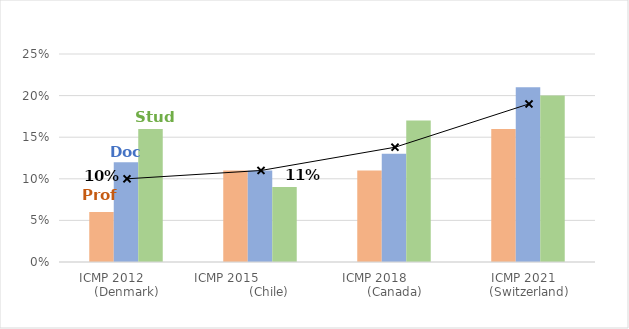
| Category | Professors | Doctors | Student |
|---|---|---|---|
| ICMP 2012         (Denmark) | 0.06 | 0.12 | 0.16 |
| ICMP 2015                       (Chile) | 0.11 | 0.11 | 0.09 |
| ICMP 2018            (Canada) | 0.11 | 0.13 | 0.17 |
| ICMP 2021    (Switzerland) | 0.16 | 0.21 | 0.2 |